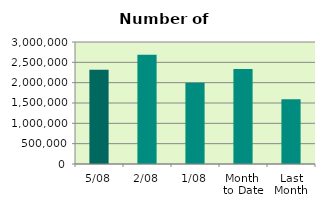
| Category | Series 0 |
|---|---|
| 5/08 | 2319276 |
| 2/08 | 2686924 |
| 1/08 | 2000438 |
| Month 
to Date | 2335546 |
| Last
Month | 1591495.826 |